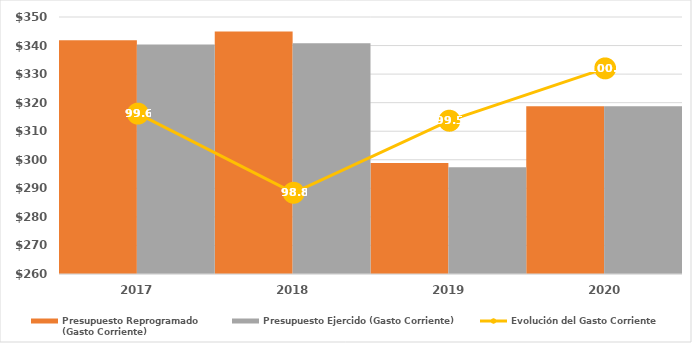
| Category | Presupuesto Reprogramado
(Gasto Corriente) | Presupuesto Ejercido (Gasto Corriente) |
|---|---|---|
| 2017.0 | 341839.2 | 340334.7 |
| 2018.0 | 344938.7 | 340765 |
| 2019.0 | 298904.428 | 297383.7 |
| 2020.0 | 318785.247 | 318785.247 |